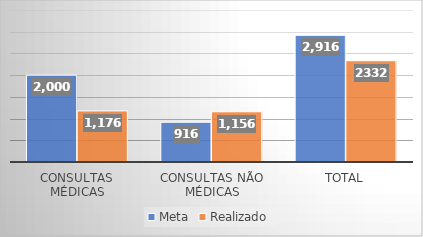
| Category | Meta | Realizado |
|---|---|---|
| Consultas Médicas | 2000 | 1176 |
| Consultas não médicas | 916 | 1156 |
| Total | 2916 | 2332 |